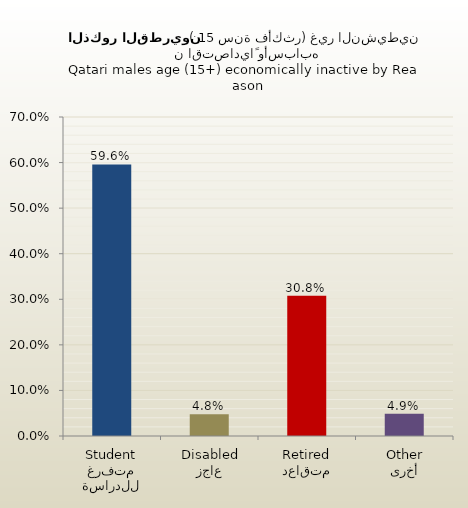
| Category | الذكور القطريين |
|---|---|
| متفرغ للدراسة
Student | 0.596 |
| عاجز
Disabled | 0.048 |
| متقاعد
Retired | 0.308 |
| أخرى
Other | 0.049 |